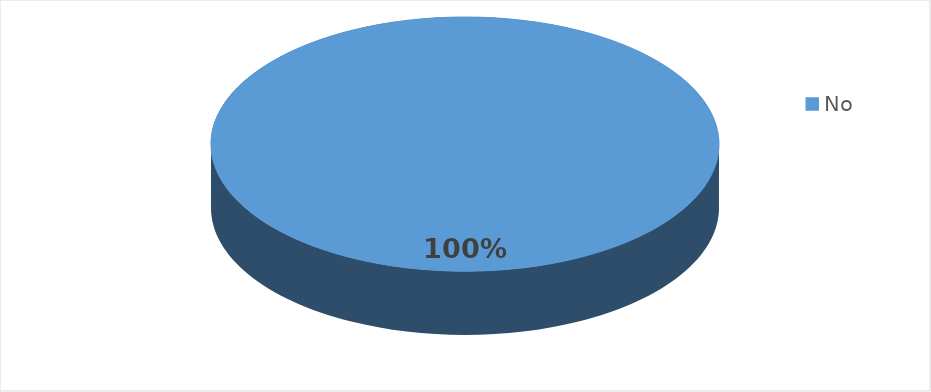
| Category | Frecuencia |
|---|---|
| No | 5 |